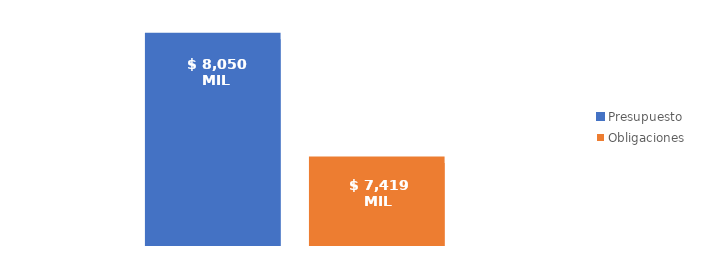
| Category | Presupuesto | Obligaciones |
|---|---|---|
| Total | 8050093408573.316 | 7418924953639.483 |